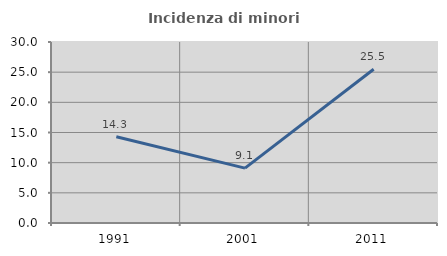
| Category | Incidenza di minori stranieri |
|---|---|
| 1991.0 | 14.286 |
| 2001.0 | 9.091 |
| 2011.0 | 25.49 |